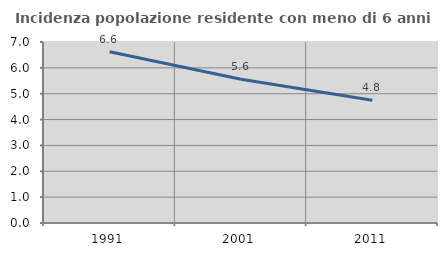
| Category | Incidenza popolazione residente con meno di 6 anni |
|---|---|
| 1991.0 | 6.627 |
| 2001.0 | 5.559 |
| 2011.0 | 4.75 |